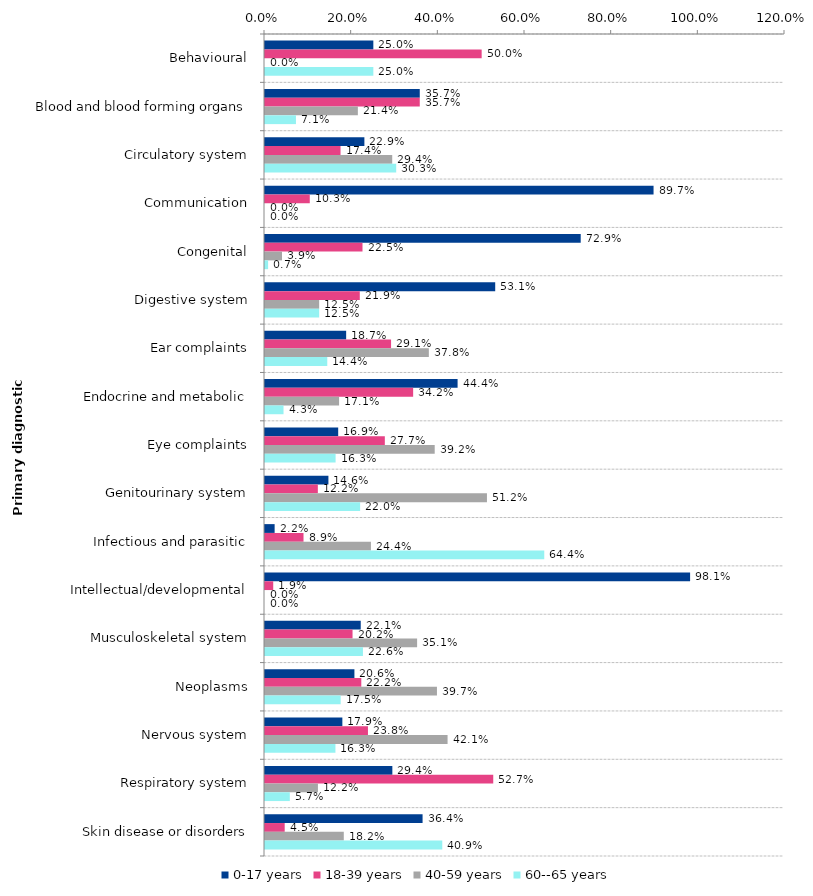
| Category | 0-17 years | 18-39 years | 40-59 years | 60--65 years |
|---|---|---|---|---|
| Behavioural | 0.25 | 0.5 | 0 | 0.25 |
| Blood and blood forming organs | 0.357 | 0.357 | 0.214 | 0.071 |
| Circulatory system | 0.229 | 0.174 | 0.294 | 0.303 |
| Communication | 0.897 | 0.103 | 0 | 0 |
| Congenital | 0.729 | 0.225 | 0.039 | 0.007 |
| Digestive system | 0.531 | 0.219 | 0.125 | 0.125 |
| Ear complaints | 0.187 | 0.291 | 0.378 | 0.144 |
| Endocrine and metabolic | 0.444 | 0.342 | 0.171 | 0.043 |
| Eye complaints | 0.169 | 0.277 | 0.392 | 0.163 |
| Genitourinary system | 0.146 | 0.122 | 0.512 | 0.22 |
| Infectious and parasitic | 0.022 | 0.089 | 0.244 | 0.644 |
| Intellectual/developmental | 0.981 | 0.019 | 0 | 0 |
| Musculoskeletal system | 0.221 | 0.202 | 0.351 | 0.226 |
| Neoplasms | 0.206 | 0.222 | 0.397 | 0.175 |
| Nervous system | 0.179 | 0.238 | 0.421 | 0.163 |
| Respiratory system | 0.294 | 0.527 | 0.122 | 0.057 |
| Skin disease or disorders | 0.364 | 0.045 | 0.182 | 0.409 |